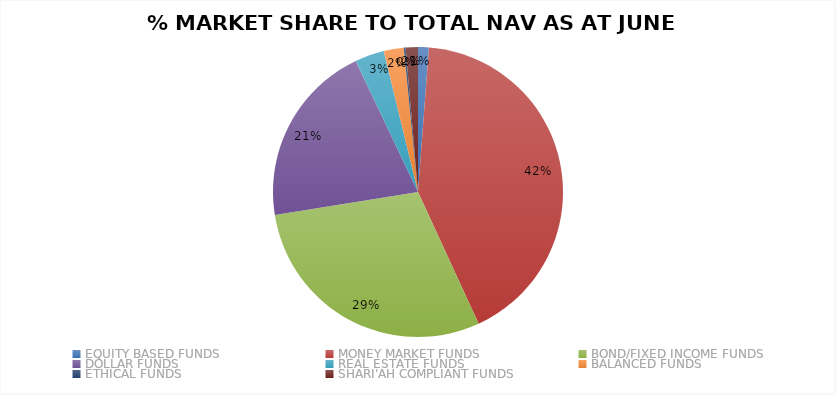
| Category | NET ASSET VALUE JUNE '22 (#BN) |
|---|---|
| EQUITY BASED FUNDS | 16.722 |
| MONEY MARKET FUNDS | 582.297 |
| BOND/FIXED INCOME FUNDS | 407.264 |
| DOLLAR FUNDS | 284.299 |
| REAL ESTATE FUNDS | 45.454 |
| BALANCED FUNDS | 30.876 |
| ETHICAL FUNDS | 2.948 |
| SHARI'AH COMPLIANT FUNDS | 18.891 |